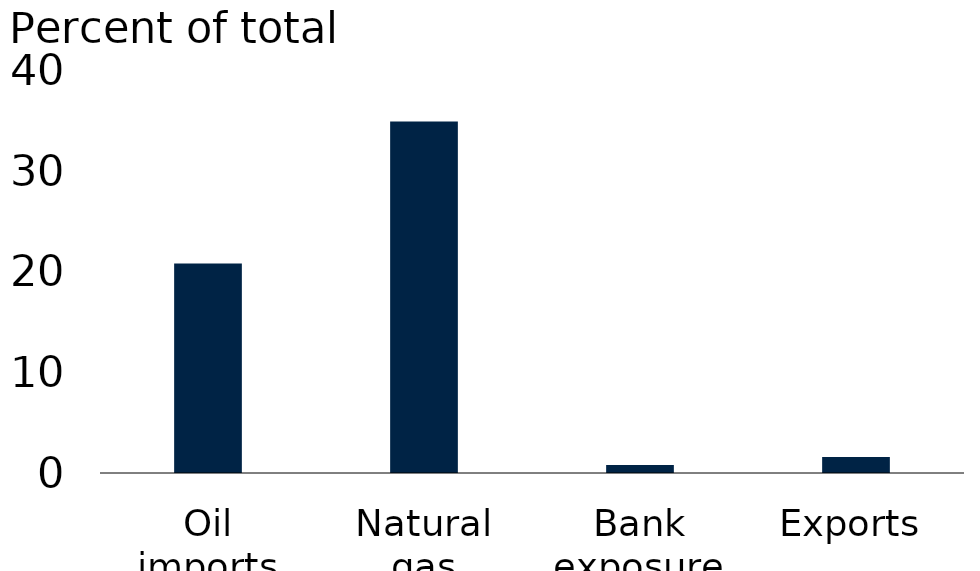
| Category | Series 0 |
|---|---|
| Oil imports | 20.8 |
| Natural gas imports | 34.9 |
| Bank exposure | 0.8 |
| Exports | 1.6 |